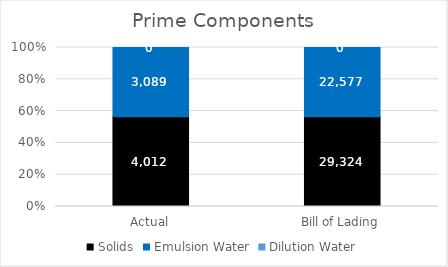
| Category | Solids | Emulsion Water | Dilution Water |
|---|---|---|---|
| Actual | 4011.5 | 3088.5 | 0 |
| Bill of Lading | 29323.5 | 22576.5 | 0 |